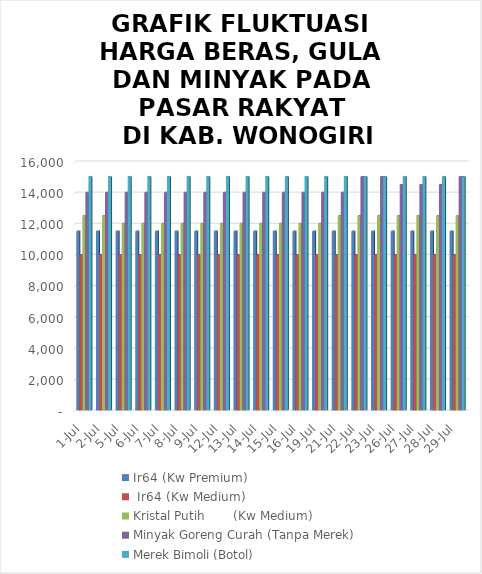
| Category | Ir64 (Kw Premium) |  Ir64 (Kw Medium) | Kristal Putih       (Kw Medium)  | Minyak Goreng Curah (Tanpa Merek) | Merek Bimoli (Botol) |
|---|---|---|---|---|---|
| 2021-07-01 | 11500 | 10000 | 12500 | 14000 | 15000 |
| 2021-07-02 | 11500 | 10000 | 12500 | 14000 | 15000 |
| 2021-07-05 | 11500 | 10000 | 12000 | 14000 | 15000 |
| 2021-07-06 | 11500 | 10000 | 12000 | 14000 | 15000 |
| 2021-07-07 | 11500 | 10000 | 12000 | 14000 | 15000 |
| 2021-07-08 | 11500 | 10000 | 12000 | 14000 | 15000 |
| 2021-07-09 | 11500 | 10000 | 12000 | 14000 | 15000 |
| 2021-07-12 | 11500 | 10000 | 12000 | 14000 | 15000 |
| 2021-07-13 | 11500 | 10000 | 12000 | 14000 | 15000 |
| 2021-07-14 | 11500 | 10000 | 12000 | 14000 | 15000 |
| 2021-07-15 | 11500 | 10000 | 12000 | 14000 | 15000 |
| 2021-07-16 | 11500 | 10000 | 12000 | 14000 | 15000 |
| 2021-07-19 | 11500 | 10000 | 12000 | 14000 | 15000 |
| 2021-07-21 | 11500 | 10000 | 12500 | 14000 | 15000 |
| 2021-07-22 | 11500 | 10000 | 12500 | 15000 | 15000 |
| 2021-07-23 | 11500 | 10000 | 12500 | 15000 | 15000 |
| 2021-07-26 | 11500 | 10000 | 12500 | 14500 | 15000 |
| 2021-07-27 | 11500 | 10000 | 12500 | 14500 | 15000 |
| 2021-07-28 | 11500 | 10000 | 12500 | 14500 | 15000 |
| 2021-07-29 | 11500 | 10000 | 12500 | 15000 | 15000 |